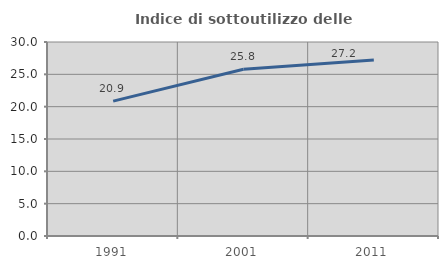
| Category | Indice di sottoutilizzo delle abitazioni  |
|---|---|
| 1991.0 | 20.854 |
| 2001.0 | 25.799 |
| 2011.0 | 27.203 |